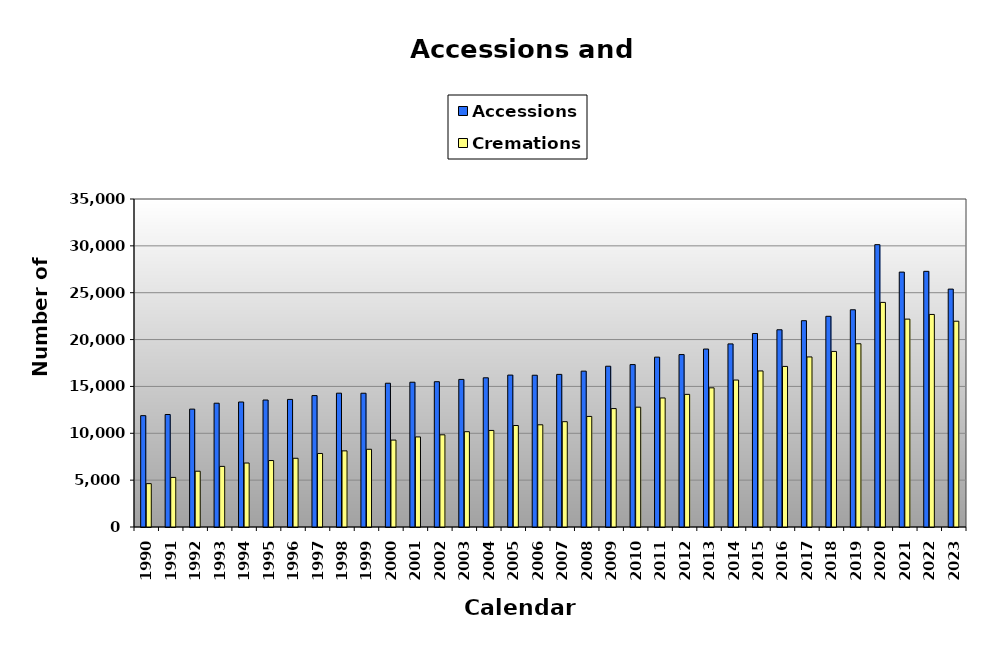
| Category | Accessions | Cremations |
|---|---|---|
| 1990.0 | 11882 | 4628 |
| 1991.0 | 12003 | 5291 |
| 1992.0 | 12579 | 5953 |
| 1993.0 | 13209 | 6469 |
| 1994.0 | 13338 | 6826 |
| 1995.0 | 13549 | 7092 |
| 1996.0 | 13614 | 7333 |
| 1997.0 | 14022 | 7845 |
| 1998.0 | 14279 | 8124 |
| 1999.0 | 14273 | 8294 |
| 2000.0 | 15342 | 9274 |
| 2001.0 | 15449 | 9611 |
| 2002.0 | 15504 | 9836 |
| 2003.0 | 15748 | 10170 |
| 2004.0 | 15920 | 10305 |
| 2005.0 | 16210 | 10830 |
| 2006.0 | 16193 | 10906 |
| 2007.0 | 16286 | 11238 |
| 2008.0 | 16631 | 11799 |
| 2009.0 | 17156 | 12635 |
| 2010.0 | 17331 | 12785 |
| 2011.0 | 18125 | 13770 |
| 2012.0 | 18400 | 14153 |
| 2013.0 | 18990 | 14849 |
| 2014.0 | 19538 | 15682 |
| 2015.0 | 20649 | 16653 |
| 2016.0 | 21046 | 17135 |
| 2017.0 | 22015 | 18146 |
| 2018.0 | 22482 | 18736 |
| 2019.0 | 23179 | 19554 |
| 2020.0 | 30129 | 23966 |
| 2021.0 | 27199 | 22183 |
| 2022.0 | 27282 | 22681 |
| 2023.0 | 25386 | 21960 |